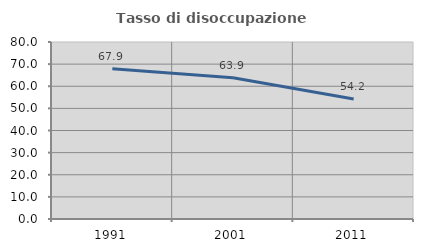
| Category | Tasso di disoccupazione giovanile  |
|---|---|
| 1991.0 | 67.908 |
| 2001.0 | 63.88 |
| 2011.0 | 54.196 |